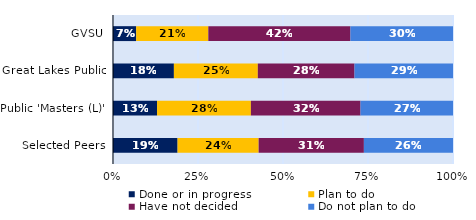
| Category | Done or in progress | Plan to do | Have not decided | Do not plan to do |
|---|---|---|---|---|
| GVSU | 0.068 | 0.212 | 0.418 | 0.302 |
| Great Lakes Public | 0.179 | 0.247 | 0.284 | 0.29 |
| Public 'Masters (L)' | 0.13 | 0.276 | 0.322 | 0.272 |
| Selected Peers | 0.19 | 0.238 | 0.31 | 0.262 |